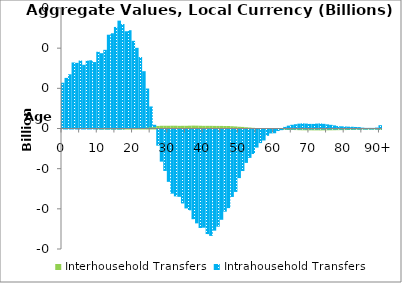
| Category | Interhousehold Transfers | Intrahousehold Transfers |
|---|---|---|
| 0 | 0 | 57.008 |
|  | 0 | 62.996 |
| 2 | 0 | 67.493 |
| 3 | 0 | 82.213 |
| 4 | 0 | 81.724 |
| 5 | 0 | 84.604 |
| 6 | 0 | 79.285 |
| 7 | 0 | 84.456 |
| 8 | 0 | 84.912 |
| 9 | 0 | 82.734 |
| 10 | 0 | 95.523 |
| 11 | 0 | 93.738 |
| 12 | 0 | 97.941 |
| 13 | -0.001 | 116.742 |
| 14 | -0.002 | 118.552 |
| 15 | -0.023 | 126.431 |
| 16 | -0.05 | 134.284 |
| 17 | -0.078 | 130.024 |
| 18 | 0.66 | 120.405 |
| 19 | 0.812 | 121.534 |
| 20 | 0.965 | 108.181 |
| 21 | 1.222 | 99.214 |
| 22 | 1.527 | 87.387 |
| 23 | 1.867 | 69.465 |
| 24 | 2.217 | 47.553 |
| 25 | 2.617 | 24.839 |
| 26 | 2.884 | 1.723 |
| 27 | 3.184 | -20.135 |
| 28 | 3.407 | -39.998 |
| 29 | 3.413 | -51.613 |
| 30 | 3.403 | -65.166 |
| 31 | 3.473 | -79.86 |
| 32 | 3.467 | -83.236 |
| 33 | 3.321 | -83.838 |
| 34 | 3.382 | -92.051 |
| 35 | 3.37 | -98.266 |
| 36 | 3.507 | -100.591 |
| 37 | 3.615 | -111.685 |
| 38 | 3.561 | -116.858 |
| 39 | 3.431 | -122.571 |
| 40 | 3.313 | -122.246 |
| 41 | 3.327 | -130.213 |
| 42 | 3.336 | -132.436 |
| 43 | 3.253 | -125.92 |
| 44 | 3.231 | -120.964 |
| 45 | 3.217 | -112.374 |
| 46 | 3.123 | -102.312 |
| 47 | 3.098 | -97.865 |
| 48 | 2.824 | -83.96 |
| 49 | 2.571 | -77.698 |
| 50 | 2.211 | -60.5 |
| 51 | 1.978 | -51.726 |
| 52 | 1.567 | -41.579 |
| 53 | 1.225 | -35.319 |
| 54 | 0.845 | -30.494 |
| 55 | 0.589 | -22.504 |
| 56 | 0.394 | -16.911 |
| 57 | 0.269 | -13.703 |
| 58 | 0.088 | -7.853 |
| 59 | -0.044 | -4.858 |
| 60 | -0.216 | -4.484 |
| 61 | -0.353 | -1.554 |
| 62 | -0.507 | -0.302 |
| 63 | -0.629 | 2.056 |
| 64 | -0.656 | 3.594 |
| 65 | -0.655 | 4.636 |
| 66 | -0.707 | 5.317 |
| 67 | -0.854 | 6.019 |
| 68 | -0.947 | 6.442 |
| 69 | -0.995 | 6.113 |
| 70 | -1.021 | 5.748 |
| 71 | -1.064 | 5.727 |
| 72 | -1.075 | 6.08 |
| 73 | -1.126 | 6.317 |
| 74 | -1.064 | 5.809 |
| 75 | -1.014 | 5.153 |
| 76 | -0.978 | 4.592 |
| 77 | -0.916 | 3.887 |
| 78 | -0.847 | 3.154 |
| 79 | -0.769 | 2.72 |
| 80 | -0.722 | 2.535 |
| 81 | -0.641 | 2.296 |
| 82 | -0.574 | 2.181 |
| 83 | -0.457 | 1.906 |
| 84 | -0.395 | 1.75 |
| 85 | -0.227 | 1.063 |
| 86 | -0.155 | 0.764 |
| 87 | -0.15 | 0.784 |
| 88 | -0.126 | 0.764 |
| 89 | -0.181 | 1.164 |
| 90+ | -0.608 | 4.114 |